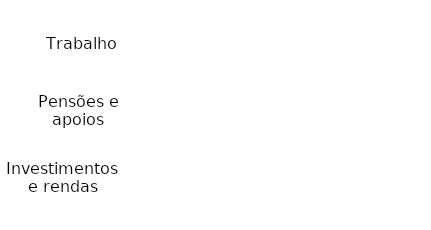
| Category | Series 0 |
|---|---|
| Investimentos e rendas | 0 |
| Pensões e apoios | 0 |
| Trabalho | 0 |